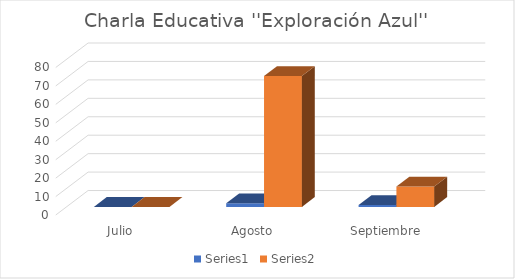
| Category | Series 0 | Series 1 |
|---|---|---|
| Julio | 0 | 0 |
| Agosto | 2 | 71 |
| Septiembre | 1 | 11 |